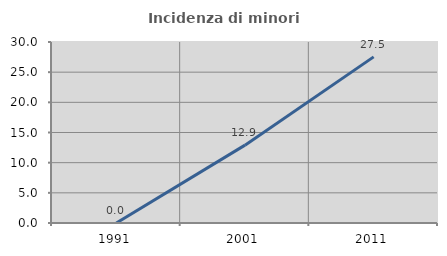
| Category | Incidenza di minori stranieri |
|---|---|
| 1991.0 | 0 |
| 2001.0 | 12.903 |
| 2011.0 | 27.536 |